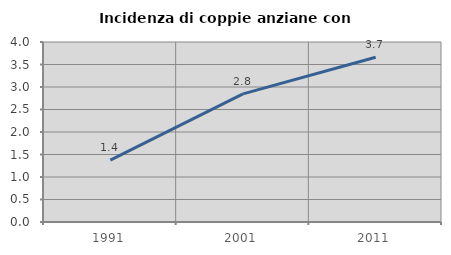
| Category | Incidenza di coppie anziane con figli |
|---|---|
| 1991.0 | 1.373 |
| 2001.0 | 2.848 |
| 2011.0 | 3.662 |